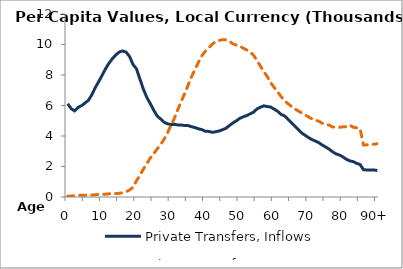
| Category | Private Transfers, Inflows | Private Transfers, Outflows |
|---|---|---|
| 0 | 6114.114 | 42.043 |
|  | 5793.383 | 60.237 |
| 2 | 5645.734 | 87.471 |
| 3 | 5875.698 | 110.132 |
| 4 | 5981.277 | 115.806 |
| 5 | 6162.29 | 120.623 |
| 6 | 6336.584 | 132.926 |
| 7 | 6696.677 | 131.101 |
| 8 | 7168.463 | 144.036 |
| 9 | 7565.838 | 179.73 |
| 10 | 7977.394 | 180.334 |
| 11 | 8410.928 | 181.894 |
| 12 | 8773.338 | 207.695 |
| 13 | 9073.534 | 235.643 |
| 14 | 9319.454 | 221.276 |
| 15 | 9507.933 | 243.334 |
| 16 | 9579.042 | 282.004 |
| 17 | 9494.704 | 344.463 |
| 18 | 9204.97 | 458.854 |
| 19 | 8683.036 | 645.812 |
| 20 | 8398.3 | 1070.485 |
| 21 | 7729.352 | 1422.914 |
| 22 | 7067.556 | 1831.54 |
| 23 | 6529.486 | 2191.817 |
| 24 | 6123.047 | 2550.03 |
| 25 | 5692.6 | 2845.886 |
| 26 | 5314.044 | 3147.963 |
| 27 | 5117.916 | 3434.736 |
| 28 | 4900.905 | 3776.895 |
| 29 | 4800.287 | 4199.745 |
| 30 | 4752.741 | 4692.222 |
| 31 | 4764.774 | 5155.452 |
| 32 | 4724.324 | 5728.32 |
| 33 | 4717.272 | 6259.626 |
| 34 | 4689.05 | 6786.983 |
| 35 | 4684.617 | 7339.063 |
| 36 | 4609.034 | 7886.676 |
| 37 | 4554.139 | 8361.7 |
| 38 | 4472.183 | 8828.642 |
| 39 | 4416.908 | 9262.883 |
| 40 | 4310.775 | 9554.644 |
| 41 | 4302.008 | 9775.306 |
| 42 | 4240.231 | 10013.528 |
| 43 | 4274.839 | 10200.811 |
| 44 | 4327.853 | 10267.041 |
| 45 | 4410.885 | 10311.301 |
| 46 | 4504.056 | 10315.917 |
| 47 | 4683.597 | 10215.83 |
| 48 | 4853.281 | 10047.725 |
| 49 | 4991.725 | 9963.222 |
| 50 | 5154.561 | 9894.403 |
| 51 | 5253.507 | 9761.665 |
| 52 | 5336.656 | 9648.919 |
| 53 | 5451.446 | 9518.396 |
| 54 | 5557.833 | 9305.353 |
| 55 | 5769.839 | 8956.441 |
| 56 | 5884.357 | 8590.447 |
| 57 | 5978.916 | 8218.926 |
| 58 | 5931.11 | 7900.298 |
| 59 | 5899.938 | 7495.038 |
| 60 | 5764.14 | 7196.842 |
| 61 | 5627.163 | 6897.983 |
| 62 | 5423.064 | 6595.603 |
| 63 | 5321.75 | 6319.088 |
| 64 | 5113.633 | 6128.797 |
| 65 | 4885.823 | 5949.599 |
| 66 | 4651.663 | 5779.107 |
| 67 | 4434.002 | 5647.707 |
| 68 | 4200.123 | 5515.859 |
| 69 | 4049.666 | 5389.995 |
| 70 | 3900.724 | 5249.176 |
| 71 | 3766.314 | 5125.471 |
| 72 | 3667.58 | 5045.462 |
| 73 | 3561.113 | 4967.654 |
| 74 | 3407.125 | 4835.951 |
| 75 | 3276.241 | 4769.392 |
| 76 | 3142.051 | 4711.364 |
| 77 | 2962.757 | 4594.376 |
| 78 | 2826.662 | 4562.982 |
| 79 | 2751.475 | 4567.946 |
| 80 | 2631.338 | 4600.878 |
| 81 | 2473.272 | 4609.406 |
| 82 | 2368.589 | 4715.565 |
| 83 | 2321.48 | 4575.23 |
| 84 | 2206.478 | 4539.179 |
| 85 | 2130.531 | 4481.229 |
| 86 | 1782.457 | 3413.546 |
| 87 | 1776.729 | 3419.465 |
| 88 | 1774.553 | 3444.257 |
| 89 | 1774.253 | 3463.019 |
| 90+ | 1736.435 | 3494.839 |